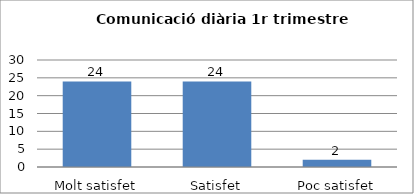
| Category | Series 0 |
|---|---|
| Molt satisfet | 24 |
| Satisfet | 24 |
| Poc satisfet | 2 |